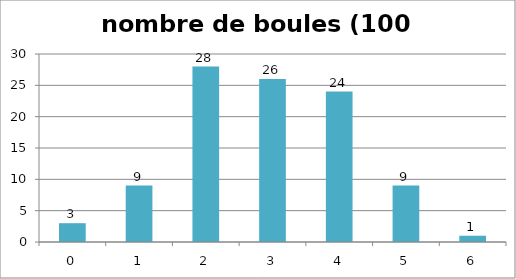
| Category | nombre de boules (100 lancers) |
|---|---|
| 0.0 | 3 |
| 1.0 | 9 |
| 2.0 | 28 |
| 3.0 | 26 |
| 4.0 | 24 |
| 5.0 | 9 |
| 6.0 | 1 |